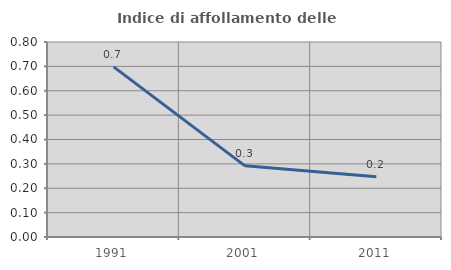
| Category | Indice di affollamento delle abitazioni  |
|---|---|
| 1991.0 | 0.698 |
| 2001.0 | 0.292 |
| 2011.0 | 0.247 |